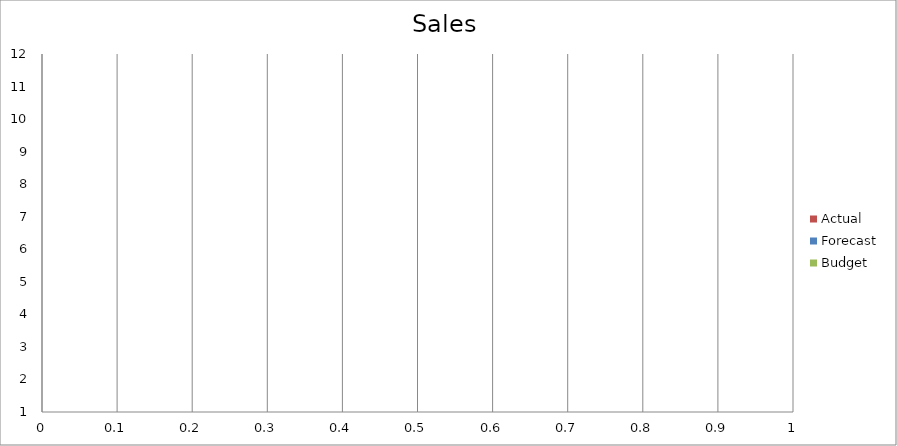
| Category | Budget | Forecast | Actual |
|---|---|---|---|
| 0 | 2190 | 2260 | 1730 |
| 1 | 1560 | 1650 | 2280 |
| 2 | 2030 | 3480 | 2560 |
| 3 | 2620 | 650 | 1000 |
| 4 | 2270 | 2070 | 1190 |
| 5 | 1640 | 1590 | 2310 |
| 6 | 3490 | 530 | 1030 |
| 7 | 3490 | 2240 | 2640 |
| 8 | 2420 | 2240 | 1800 |
| 9 | 1620 | 1680 | 1480 |
| 10 | 2160 | 3120 | 1710 |
| 11 | 1410 | 2240 | 1840 |